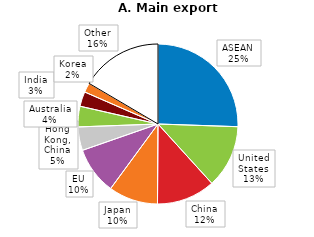
| Category | Series 0 |
|---|---|
| ASEAN | 25.541 |
| United States | 12.731 |
| China | 11.829 |
| Japan | 9.975 |
| EU | 9.581 |
| Hong Kong, China | 4.757 |
| Australia | 4.157 |
| India | 2.984 |
| Korea | 1.922 |
| Other | 16.524 |